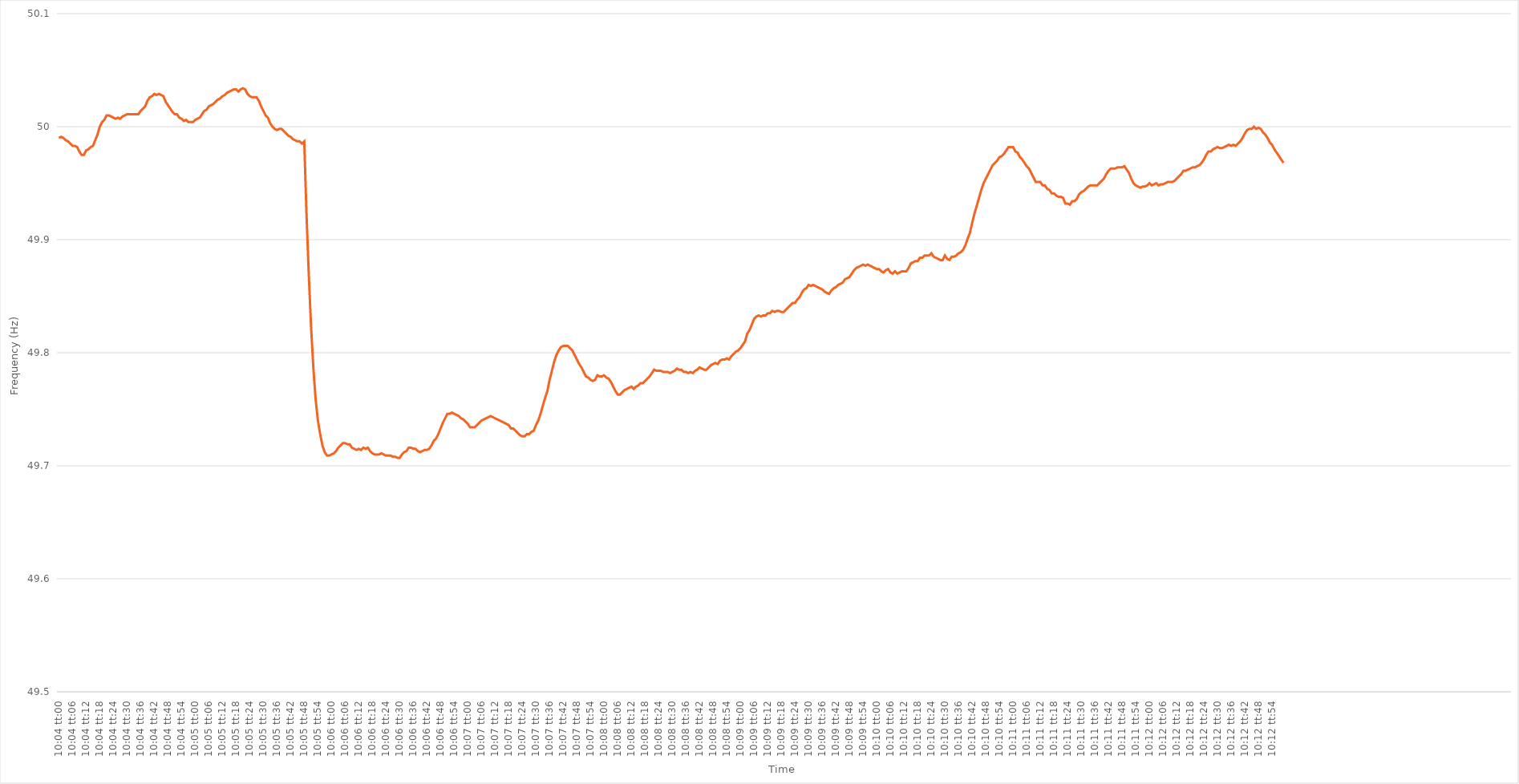
| Category | Series 0 |
|---|---|
| 0.41944444444444445 | 49.99 |
| 0.41945601851851855 | 49.991 |
| 0.4194675925925926 | 49.99 |
| 0.4194791666666667 | 49.988 |
| 0.4194907407407407 | 49.987 |
| 0.41950231481481487 | 49.985 |
| 0.4195138888888889 | 49.983 |
| 0.41952546296296295 | 49.983 |
| 0.41953703703703704 | 49.982 |
| 0.4195486111111111 | 49.978 |
| 0.4195601851851852 | 49.975 |
| 0.4195717592592592 | 49.975 |
| 0.41958333333333336 | 49.979 |
| 0.4195949074074074 | 49.98 |
| 0.4196064814814815 | 49.982 |
| 0.41961805555555554 | 49.983 |
| 0.41962962962962963 | 49.988 |
| 0.41964120370370367 | 49.993 |
| 0.4196527777777778 | 50 |
| 0.41966435185185186 | 50.004 |
| 0.41967592592592595 | 50.006 |
| 0.4196875 | 50.01 |
| 0.4196990740740741 | 50.01 |
| 0.4197106481481481 | 50.009 |
| 0.4197222222222223 | 50.008 |
| 0.4197337962962963 | 50.007 |
| 0.41974537037037035 | 50.008 |
| 0.41975694444444445 | 50.007 |
| 0.4197685185185185 | 50.009 |
| 0.4197800925925926 | 50.01 |
| 0.4197916666666666 | 50.011 |
| 0.41980324074074077 | 50.011 |
| 0.4198148148148148 | 50.011 |
| 0.4198263888888889 | 50.011 |
| 0.41983796296296294 | 50.011 |
| 0.41984953703703703 | 50.011 |
| 0.4198611111111111 | 50.014 |
| 0.4198726851851852 | 50.016 |
| 0.41988425925925926 | 50.018 |
| 0.41989583333333336 | 50.023 |
| 0.4199074074074074 | 50.026 |
| 0.4199189814814815 | 50.027 |
| 0.41993055555555553 | 50.029 |
| 0.4199421296296297 | 50.028 |
| 0.4199537037037037 | 50.029 |
| 0.4199652777777778 | 50.028 |
| 0.41997685185185185 | 50.027 |
| 0.4199884259259259 | 50.022 |
| 0.42 | 50.019 |
| 0.420011574074074 | 50.016 |
| 0.4200231481481482 | 50.013 |
| 0.4200347222222222 | 50.011 |
| 0.4200462962962963 | 50.011 |
| 0.42005787037037035 | 50.008 |
| 0.42006944444444444 | 50.007 |
| 0.4200810185185185 | 50.005 |
| 0.42009259259259263 | 50.006 |
| 0.42010416666666667 | 50.004 |
| 0.42011574074074076 | 50.004 |
| 0.4201273148148148 | 50.004 |
| 0.4201388888888889 | 50.006 |
| 0.42015046296296293 | 50.007 |
| 0.4201620370370371 | 50.008 |
| 0.4201736111111111 | 50.011 |
| 0.4201851851851852 | 50.014 |
| 0.42019675925925926 | 50.015 |
| 0.42020833333333335 | 50.018 |
| 0.4202199074074074 | 50.019 |
| 0.42023148148148143 | 50.02 |
| 0.4202430555555556 | 50.022 |
| 0.4202546296296296 | 50.024 |
| 0.4202662037037037 | 50.025 |
| 0.42027777777777775 | 50.027 |
| 0.42028935185185184 | 50.028 |
| 0.4203009259259259 | 50.03 |
| 0.42031250000000003 | 50.031 |
| 0.42032407407407407 | 50.032 |
| 0.42033564814814817 | 50.033 |
| 0.4203472222222222 | 50.033 |
| 0.4203587962962963 | 50.031 |
| 0.42037037037037034 | 50.033 |
| 0.4203819444444445 | 50.034 |
| 0.4203935185185185 | 50.033 |
| 0.4204050925925926 | 50.029 |
| 0.42041666666666666 | 50.027 |
| 0.42042824074074076 | 50.026 |
| 0.4204398148148148 | 50.026 |
| 0.42045138888888894 | 50.026 |
| 0.420462962962963 | 50.023 |
| 0.420474537037037 | 50.018 |
| 0.4204861111111111 | 50.014 |
| 0.42049768518518515 | 50.01 |
| 0.42050925925925925 | 50.008 |
| 0.4205208333333333 | 50.003 |
| 0.42053240740740744 | 50 |
| 0.4205439814814815 | 49.998 |
| 0.42055555555555557 | 49.997 |
| 0.4205671296296296 | 49.998 |
| 0.4205787037037037 | 49.998 |
| 0.42059027777777774 | 49.996 |
| 0.4206018518518519 | 49.994 |
| 0.42061342592592593 | 49.992 |
| 0.420625 | 49.991 |
| 0.42063657407407407 | 49.989 |
| 0.42064814814814816 | 49.988 |
| 0.4206597222222222 | 49.987 |
| 0.42067129629629635 | 49.987 |
| 0.4206828703703704 | 49.985 |
| 0.4206944444444444 | 49.987 |
| 0.4207060185185185 | 49.922 |
| 0.42071759259259256 | 49.869 |
| 0.42072916666666665 | 49.823 |
| 0.4207407407407407 | 49.787 |
| 0.42075231481481484 | 49.759 |
| 0.4207638888888889 | 49.74 |
| 0.420775462962963 | 49.728 |
| 0.420787037037037 | 49.718 |
| 0.4207986111111111 | 49.712 |
| 0.42081018518518515 | 49.709 |
| 0.4208217592592593 | 49.709 |
| 0.42083333333333334 | 49.71 |
| 0.42084490740740743 | 49.711 |
| 0.42085648148148147 | 49.713 |
| 0.42086805555555556 | 49.716 |
| 0.4208796296296296 | 49.718 |
| 0.42089120370370375 | 49.72 |
| 0.4209027777777778 | 49.72 |
| 0.4209143518518519 | 49.719 |
| 0.4209259259259259 | 49.719 |
| 0.42093749999999996 | 49.716 |
| 0.42094907407407406 | 49.715 |
| 0.4209606481481481 | 49.714 |
| 0.42097222222222225 | 49.715 |
| 0.4209837962962963 | 49.714 |
| 0.4209953703703704 | 49.716 |
| 0.4210069444444444 | 49.715 |
| 0.4210185185185185 | 49.716 |
| 0.42103009259259255 | 49.713 |
| 0.4210416666666667 | 49.711 |
| 0.42105324074074074 | 49.71 |
| 0.42106481481481484 | 49.71 |
| 0.4210763888888889 | 49.71 |
| 0.42108796296296297 | 49.711 |
| 0.421099537037037 | 49.71 |
| 0.42111111111111116 | 49.709 |
| 0.4211226851851852 | 49.709 |
| 0.4211342592592593 | 49.709 |
| 0.42114583333333333 | 49.708 |
| 0.4211574074074074 | 49.708 |
| 0.42116898148148146 | 49.707 |
| 0.4211805555555555 | 49.707 |
| 0.42119212962962965 | 49.71 |
| 0.4212037037037037 | 49.712 |
| 0.4212152777777778 | 49.713 |
| 0.4212268518518518 | 49.716 |
| 0.4212384259259259 | 49.716 |
| 0.42124999999999996 | 49.715 |
| 0.4212615740740741 | 49.715 |
| 0.42127314814814815 | 49.713 |
| 0.42128472222222224 | 49.712 |
| 0.4212962962962963 | 49.713 |
| 0.4213078703703704 | 49.714 |
| 0.4213194444444444 | 49.714 |
| 0.42133101851851856 | 49.715 |
| 0.4213425925925926 | 49.718 |
| 0.4213541666666667 | 49.722 |
| 0.42136574074074074 | 49.724 |
| 0.42137731481481483 | 49.728 |
| 0.42138888888888887 | 49.733 |
| 0.421400462962963 | 49.738 |
| 0.42141203703703706 | 49.742 |
| 0.4214236111111111 | 49.746 |
| 0.4214351851851852 | 49.746 |
| 0.42144675925925923 | 49.747 |
| 0.4214583333333333 | 49.746 |
| 0.42146990740740736 | 49.745 |
| 0.4214814814814815 | 49.744 |
| 0.42149305555555555 | 49.742 |
| 0.42150462962962965 | 49.741 |
| 0.4215162037037037 | 49.739 |
| 0.4215277777777778 | 49.737 |
| 0.4215393518518518 | 49.734 |
| 0.42155092592592597 | 49.734 |
| 0.4215625 | 49.734 |
| 0.4215740740740741 | 49.736 |
| 0.42158564814814814 | 49.738 |
| 0.42159722222222223 | 49.74 |
| 0.4216087962962963 | 49.741 |
| 0.4216203703703704 | 49.742 |
| 0.42163194444444446 | 49.743 |
| 0.4216435185185185 | 49.744 |
| 0.4216550925925926 | 49.743 |
| 0.42166666666666663 | 49.742 |
| 0.42167824074074073 | 49.741 |
| 0.42168981481481477 | 49.74 |
| 0.4217013888888889 | 49.739 |
| 0.42171296296296296 | 49.738 |
| 0.42172453703703705 | 49.737 |
| 0.4217361111111111 | 49.736 |
| 0.4217476851851852 | 49.733 |
| 0.4217592592592592 | 49.733 |
| 0.4217708333333334 | 49.731 |
| 0.4217824074074074 | 49.729 |
| 0.4217939814814815 | 49.727 |
| 0.42180555555555554 | 49.726 |
| 0.42181712962962964 | 49.726 |
| 0.4218287037037037 | 49.728 |
| 0.42184027777777783 | 49.728 |
| 0.42185185185185187 | 49.73 |
| 0.42186342592592596 | 49.731 |
| 0.421875 | 49.736 |
| 0.42188657407407404 | 49.74 |
| 0.42189814814814813 | 49.746 |
| 0.42190972222222217 | 49.753 |
| 0.4219212962962963 | 49.76 |
| 0.42193287037037036 | 49.766 |
| 0.42194444444444446 | 49.776 |
| 0.4219560185185185 | 49.784 |
| 0.4219675925925926 | 49.792 |
| 0.4219791666666666 | 49.798 |
| 0.4219907407407408 | 49.802 |
| 0.4220023148148148 | 49.805 |
| 0.4220138888888889 | 49.806 |
| 0.42202546296296295 | 49.806 |
| 0.42203703703703704 | 49.806 |
| 0.4220486111111111 | 49.804 |
| 0.42206018518518523 | 49.802 |
| 0.42207175925925927 | 49.798 |
| 0.42208333333333337 | 49.794 |
| 0.4220949074074074 | 49.79 |
| 0.4221064814814815 | 49.787 |
| 0.42211805555555554 | 49.783 |
| 0.4221296296296296 | 49.779 |
| 0.4221412037037037 | 49.778 |
| 0.42215277777777777 | 49.776 |
| 0.42216435185185186 | 49.775 |
| 0.4221759259259259 | 49.776 |
| 0.4221875 | 49.78 |
| 0.42219907407407403 | 49.779 |
| 0.4222106481481482 | 49.779 |
| 0.4222222222222222 | 49.78 |
| 0.4222337962962963 | 49.778 |
| 0.42224537037037035 | 49.777 |
| 0.42225694444444445 | 49.774 |
| 0.4222685185185185 | 49.77 |
| 0.42228009259259264 | 49.766 |
| 0.4222916666666667 | 49.763 |
| 0.42230324074074077 | 49.763 |
| 0.4223148148148148 | 49.765 |
| 0.4223263888888889 | 49.767 |
| 0.42233796296296294 | 49.768 |
| 0.422349537037037 | 49.769 |
| 0.42236111111111113 | 49.77 |
| 0.42237268518518517 | 49.768 |
| 0.42238425925925926 | 49.77 |
| 0.4223958333333333 | 49.771 |
| 0.4224074074074074 | 49.773 |
| 0.42241898148148144 | 49.773 |
| 0.4224305555555556 | 49.775 |
| 0.4224421296296296 | 49.777 |
| 0.4224537037037037 | 49.779 |
| 0.42246527777777776 | 49.782 |
| 0.42247685185185185 | 49.785 |
| 0.4224884259259259 | 49.784 |
| 0.42250000000000004 | 49.784 |
| 0.4225115740740741 | 49.784 |
| 0.4225231481481482 | 49.783 |
| 0.4225347222222222 | 49.783 |
| 0.4225462962962963 | 49.783 |
| 0.42255787037037035 | 49.782 |
| 0.4225694444444445 | 49.783 |
| 0.42258101851851854 | 49.784 |
| 0.4225925925925926 | 49.786 |
| 0.42260416666666667 | 49.785 |
| 0.4226157407407407 | 49.785 |
| 0.4226273148148148 | 49.783 |
| 0.42263888888888884 | 49.783 |
| 0.422650462962963 | 49.782 |
| 0.42266203703703703 | 49.783 |
| 0.4226736111111111 | 49.782 |
| 0.42268518518518516 | 49.784 |
| 0.42269675925925926 | 49.785 |
| 0.4227083333333333 | 49.787 |
| 0.42271990740740745 | 49.786 |
| 0.4227314814814815 | 49.785 |
| 0.4227430555555556 | 49.785 |
| 0.4227546296296296 | 49.787 |
| 0.4227662037037037 | 49.789 |
| 0.42277777777777775 | 49.79 |
| 0.4227893518518519 | 49.791 |
| 0.42280092592592594 | 49.79 |
| 0.42281250000000004 | 49.793 |
| 0.4228240740740741 | 49.794 |
| 0.4228356481481481 | 49.794 |
| 0.4228472222222222 | 49.795 |
| 0.42285879629629625 | 49.794 |
| 0.4228703703703704 | 49.797 |
| 0.42288194444444444 | 49.799 |
| 0.42289351851851853 | 49.801 |
| 0.42290509259259257 | 49.802 |
| 0.42291666666666666 | 49.804 |
| 0.4229282407407407 | 49.807 |
| 0.42293981481481485 | 49.81 |
| 0.4229513888888889 | 49.817 |
| 0.422962962962963 | 49.82 |
| 0.422974537037037 | 49.825 |
| 0.4229861111111111 | 49.83 |
| 0.42299768518518516 | 49.832 |
| 0.4230092592592593 | 49.833 |
| 0.42302083333333335 | 49.832 |
| 0.42303240740740744 | 49.833 |
| 0.4230439814814815 | 49.833 |
| 0.4230555555555555 | 49.835 |
| 0.4230671296296296 | 49.835 |
| 0.42307870370370365 | 49.837 |
| 0.4230902777777778 | 49.836 |
| 0.42310185185185184 | 49.837 |
| 0.42311342592592593 | 49.837 |
| 0.423125 | 49.836 |
| 0.42313657407407407 | 49.836 |
| 0.4231481481481481 | 49.838 |
| 0.42315972222222226 | 49.84 |
| 0.4231712962962963 | 49.842 |
| 0.4231828703703704 | 49.844 |
| 0.42319444444444443 | 49.844 |
| 0.4232060185185185 | 49.847 |
| 0.42321759259259256 | 49.849 |
| 0.4232291666666667 | 49.853 |
| 0.42324074074074075 | 49.856 |
| 0.42325231481481485 | 49.857 |
| 0.4232638888888889 | 49.86 |
| 0.423275462962963 | 49.859 |
| 0.423287037037037 | 49.86 |
| 0.42329861111111117 | 49.859 |
| 0.4233101851851852 | 49.858 |
| 0.42332175925925924 | 49.857 |
| 0.42333333333333334 | 49.856 |
| 0.4233449074074074 | 49.854 |
| 0.4233564814814815 | 49.853 |
| 0.4233680555555555 | 49.852 |
| 0.42337962962962966 | 49.855 |
| 0.4233912037037037 | 49.857 |
| 0.4234027777777778 | 49.858 |
| 0.42341435185185183 | 49.86 |
| 0.42342592592592593 | 49.861 |
| 0.42343749999999997 | 49.862 |
| 0.4234490740740741 | 49.865 |
| 0.42346064814814816 | 49.866 |
| 0.42347222222222225 | 49.867 |
| 0.4234837962962963 | 49.87 |
| 0.4234953703703704 | 49.873 |
| 0.4235069444444444 | 49.875 |
| 0.42351851851851857 | 49.876 |
| 0.4235300925925926 | 49.877 |
| 0.42354166666666665 | 49.878 |
| 0.42355324074074074 | 49.877 |
| 0.4235648148148148 | 49.878 |
| 0.4235763888888889 | 49.877 |
| 0.4235879629629629 | 49.876 |
| 0.42359953703703707 | 49.875 |
| 0.4236111111111111 | 49.874 |
| 0.4236226851851852 | 49.874 |
| 0.42363425925925924 | 49.872 |
| 0.42364583333333333 | 49.871 |
| 0.42365740740740737 | 49.873 |
| 0.4236689814814815 | 49.874 |
| 0.42368055555555556 | 49.871 |
| 0.42369212962962965 | 49.87 |
| 0.4237037037037037 | 49.872 |
| 0.4237152777777778 | 49.87 |
| 0.4237268518518518 | 49.871 |
| 0.423738425925926 | 49.872 |
| 0.42375 | 49.872 |
| 0.4237615740740741 | 49.872 |
| 0.42377314814814815 | 49.875 |
| 0.4237847222222222 | 49.879 |
| 0.4237962962962963 | 49.88 |
| 0.4238078703703703 | 49.881 |
| 0.42381944444444447 | 49.881 |
| 0.4238310185185185 | 49.884 |
| 0.4238425925925926 | 49.884 |
| 0.42385416666666664 | 49.886 |
| 0.42386574074074074 | 49.886 |
| 0.4238773148148148 | 49.886 |
| 0.4238888888888889 | 49.888 |
| 0.42390046296296297 | 49.885 |
| 0.42391203703703706 | 49.884 |
| 0.4239236111111111 | 49.883 |
| 0.4239351851851852 | 49.882 |
| 0.42394675925925923 | 49.882 |
| 0.4239583333333334 | 49.886 |
| 0.4239699074074074 | 49.883 |
| 0.4239814814814815 | 49.882 |
| 0.42399305555555555 | 49.885 |
| 0.42400462962962965 | 49.885 |
| 0.4240162037037037 | 49.886 |
| 0.4240277777777777 | 49.888 |
| 0.4240393518518519 | 49.889 |
| 0.4240509259259259 | 49.891 |
| 0.4240625 | 49.895 |
| 0.42407407407407405 | 49.901 |
| 0.42408564814814814 | 49.906 |
| 0.4240972222222222 | 49.915 |
| 0.42410879629629633 | 49.923 |
| 0.42412037037037037 | 49.93 |
| 0.42413194444444446 | 49.937 |
| 0.4241435185185185 | 49.944 |
| 0.4241550925925926 | 49.95 |
| 0.42416666666666664 | 49.954 |
| 0.4241782407407408 | 49.958 |
| 0.4241898148148148 | 49.962 |
| 0.4242013888888889 | 49.966 |
| 0.42421296296296296 | 49.968 |
| 0.42422453703703705 | 49.97 |
| 0.4242361111111111 | 49.973 |
| 0.42424768518518513 | 49.974 |
| 0.4242592592592593 | 49.976 |
| 0.4242708333333333 | 49.979 |
| 0.4242824074074074 | 49.982 |
| 0.42429398148148145 | 49.982 |
| 0.42430555555555555 | 49.982 |
| 0.4243171296296296 | 49.978 |
| 0.42432870370370374 | 49.977 |
| 0.4243402777777778 | 49.973 |
| 0.42435185185185187 | 49.971 |
| 0.4243634259259259 | 49.968 |
| 0.424375 | 49.965 |
| 0.42438657407407404 | 49.963 |
| 0.4243981481481482 | 49.959 |
| 0.42440972222222223 | 49.955 |
| 0.4244212962962963 | 49.951 |
| 0.42443287037037036 | 49.951 |
| 0.42444444444444446 | 49.951 |
| 0.4244560185185185 | 49.948 |
| 0.42446759259259265 | 49.948 |
| 0.4244791666666667 | 49.945 |
| 0.4244907407407407 | 49.944 |
| 0.4245023148148148 | 49.941 |
| 0.42451388888888886 | 49.941 |
| 0.42452546296296295 | 49.939 |
| 0.424537037037037 | 49.938 |
| 0.42454861111111114 | 49.938 |
| 0.4245601851851852 | 49.937 |
| 0.4245717592592593 | 49.932 |
| 0.4245833333333333 | 49.932 |
| 0.4245949074074074 | 49.931 |
| 0.42460648148148145 | 49.934 |
| 0.4246180555555556 | 49.934 |
| 0.42462962962962963 | 49.936 |
| 0.42464120370370373 | 49.94 |
| 0.42465277777777777 | 49.942 |
| 0.42466435185185186 | 49.943 |
| 0.4246759259259259 | 49.945 |
| 0.42468750000000005 | 49.947 |
| 0.4246990740740741 | 49.948 |
| 0.4247106481481482 | 49.948 |
| 0.4247222222222222 | 49.948 |
| 0.42473379629629626 | 49.948 |
| 0.42474537037037036 | 49.95 |
| 0.4247569444444444 | 49.952 |
| 0.42476851851851855 | 49.954 |
| 0.4247800925925926 | 49.958 |
| 0.4247916666666667 | 49.961 |
| 0.4248032407407407 | 49.963 |
| 0.4248148148148148 | 49.963 |
| 0.42482638888888885 | 49.963 |
| 0.424837962962963 | 49.964 |
| 0.42484953703703704 | 49.964 |
| 0.42486111111111113 | 49.964 |
| 0.4248726851851852 | 49.965 |
| 0.42488425925925927 | 49.962 |
| 0.4248958333333333 | 49.959 |
| 0.42490740740740746 | 49.954 |
| 0.4249189814814815 | 49.95 |
| 0.4249305555555556 | 49.948 |
| 0.42494212962962963 | 49.947 |
| 0.42495370370370367 | 49.946 |
| 0.42496527777777776 | 49.947 |
| 0.4249768518518518 | 49.947 |
| 0.42498842592592595 | 49.948 |
| 0.425 | 49.95 |
| 0.4250115740740741 | 49.948 |
| 0.4250231481481481 | 49.949 |
| 0.4250347222222222 | 49.95 |
| 0.42504629629629626 | 49.948 |
| 0.4250578703703704 | 49.949 |
| 0.42506944444444444 | 49.949 |
| 0.42508101851851854 | 49.95 |
| 0.4250925925925926 | 49.951 |
| 0.42510416666666667 | 49.951 |
| 0.4251157407407407 | 49.951 |
| 0.42512731481481486 | 49.952 |
| 0.4251388888888889 | 49.954 |
| 0.425150462962963 | 49.956 |
| 0.42516203703703703 | 49.958 |
| 0.4251736111111111 | 49.961 |
| 0.42518518518518517 | 49.961 |
| 0.4251967592592592 | 49.962 |
| 0.42520833333333335 | 49.963 |
| 0.4252199074074074 | 49.964 |
| 0.4252314814814815 | 49.964 |
| 0.4252430555555555 | 49.965 |
| 0.4252546296296296 | 49.966 |
| 0.42526620370370366 | 49.968 |
| 0.4252777777777778 | 49.971 |
| 0.42528935185185185 | 49.975 |
| 0.42530092592592594 | 49.978 |
| 0.4253125 | 49.978 |
| 0.4253240740740741 | 49.98 |
| 0.4253356481481481 | 49.981 |
| 0.42534722222222227 | 49.982 |
| 0.4253587962962963 | 49.981 |
| 0.4253703703703704 | 49.981 |
| 0.42538194444444444 | 49.982 |
| 0.42539351851851853 | 49.983 |
| 0.42540509259259257 | 49.984 |
| 0.4254166666666667 | 49.983 |
| 0.42542824074074076 | 49.984 |
| 0.4254398148148148 | 49.983 |
| 0.4254513888888889 | 49.985 |
| 0.42546296296296293 | 49.987 |
| 0.425474537037037 | 49.99 |
| 0.42548611111111106 | 49.994 |
| 0.4254976851851852 | 49.997 |
| 0.42550925925925925 | 49.998 |
| 0.42552083333333335 | 49.998 |
| 0.4255324074074074 | 50 |
| 0.4255439814814815 | 49.998 |
| 0.4255555555555555 | 49.999 |
| 0.42556712962962967 | 49.998 |
| 0.4255787037037037 | 49.995 |
| 0.4255902777777778 | 49.993 |
| 0.42560185185185184 | 49.99 |
| 0.42561342592592594 | 49.986 |
| 0.425625 | 49.984 |
| 0.4256365740740741 | 49.98 |
| 0.42564814814814816 | 49.977 |
| 0.4256597222222222 | 49.974 |
| 0.4256712962962963 | 49.971 |
| 0.42568287037037034 | 49.968 |